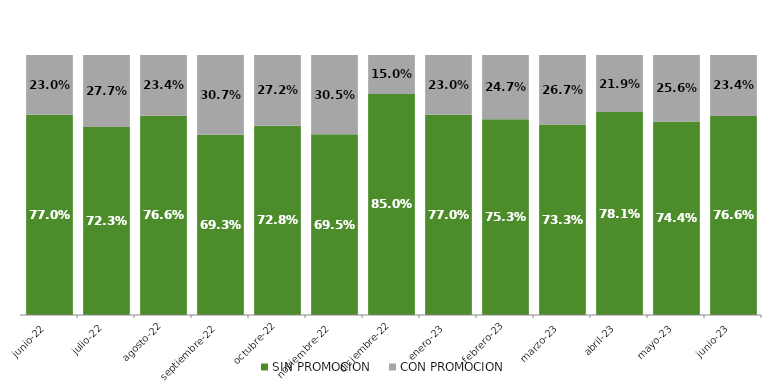
| Category | SIN PROMOCION   | CON PROMOCION   |
|---|---|---|
| 2022-06-01 | 0.77 | 0.23 |
| 2022-07-01 | 0.723 | 0.277 |
| 2022-08-01 | 0.766 | 0.234 |
| 2022-09-01 | 0.693 | 0.307 |
| 2022-10-01 | 0.728 | 0.272 |
| 2022-11-01 | 0.695 | 0.305 |
| 2022-12-01 | 0.85 | 0.15 |
| 2023-01-01 | 0.77 | 0.23 |
| 2023-02-01 | 0.753 | 0.247 |
| 2023-03-01 | 0.733 | 0.267 |
| 2023-04-01 | 0.781 | 0.219 |
| 2023-05-01 | 0.744 | 0.256 |
| 2023-06-01 | 0.766 | 0.234 |